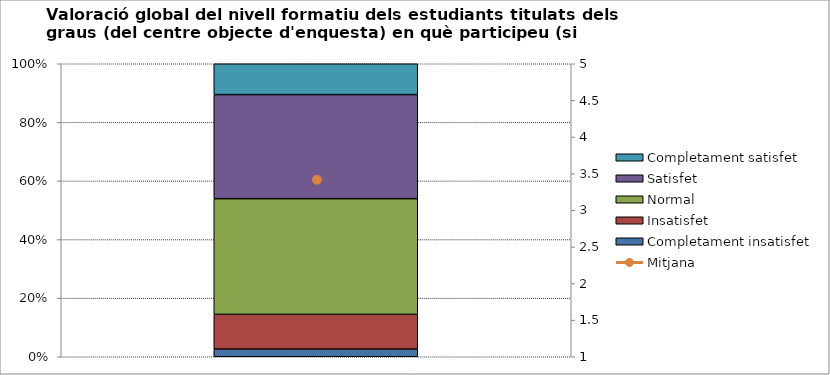
| Category | Completament insatisfet | Insatisfet | Normal | Satisfet | Completament satisfet |
|---|---|---|---|---|---|
| 0 | 2 | 9 | 30 | 27 | 8 |